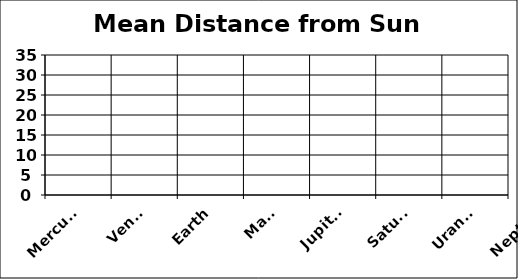
| Category | Mean Distance from Sun (AU) |
|---|---|
| Mercury | 0.39 |
| Venus | 0.72 |
| Earth | 1 |
| Mars | 1.52 |
| Jupiter | 5.2 |
| Saturn | 9.54 |
| Uranus | 19.18 |
| Neptune | 30.06 |